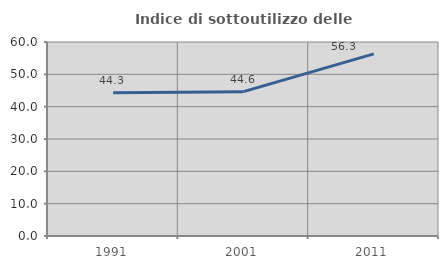
| Category | Indice di sottoutilizzo delle abitazioni  |
|---|---|
| 1991.0 | 44.28 |
| 2001.0 | 44.639 |
| 2011.0 | 56.321 |